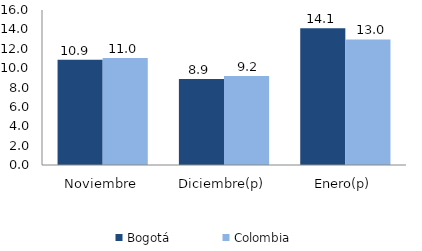
| Category | Bogotá | Colombia |
|---|---|---|
| Noviembre | 10.861 | 11.044 |
| Diciembre(p) | 8.872 | 9.177 |
| Enero(p) | 14.108 | 12.957 |